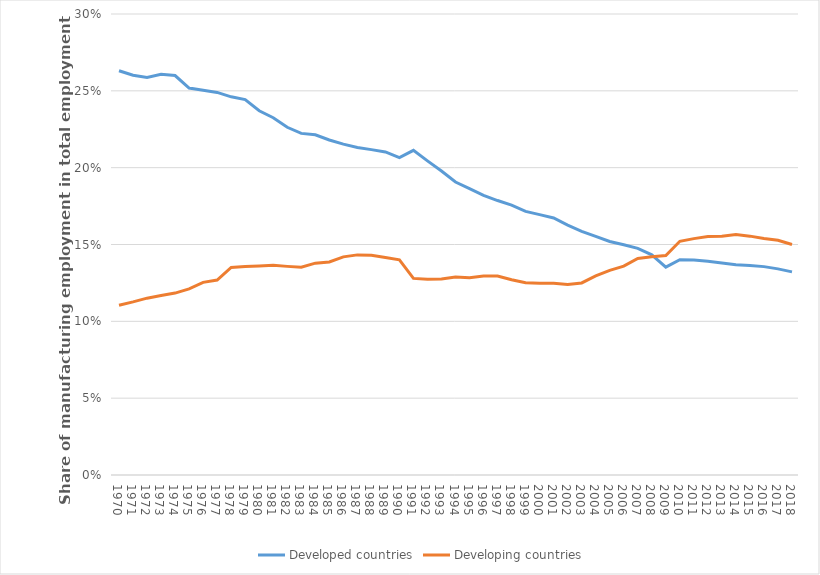
| Category | Developed countries | Developing countries |
|---|---|---|
| 1970.0 | 0.263 | 0.11 |
| 1971.0 | 0.26 | 0.113 |
| 1972.0 | 0.259 | 0.115 |
| 1973.0 | 0.261 | 0.117 |
| 1974.0 | 0.26 | 0.118 |
| 1975.0 | 0.252 | 0.121 |
| 1976.0 | 0.25 | 0.125 |
| 1977.0 | 0.249 | 0.127 |
| 1978.0 | 0.246 | 0.135 |
| 1979.0 | 0.244 | 0.136 |
| 1980.0 | 0.237 | 0.136 |
| 1981.0 | 0.232 | 0.136 |
| 1982.0 | 0.226 | 0.136 |
| 1983.0 | 0.222 | 0.135 |
| 1984.0 | 0.221 | 0.138 |
| 1985.0 | 0.218 | 0.139 |
| 1986.0 | 0.215 | 0.142 |
| 1987.0 | 0.213 | 0.143 |
| 1988.0 | 0.212 | 0.143 |
| 1989.0 | 0.21 | 0.142 |
| 1990.0 | 0.207 | 0.14 |
| 1991.0 | 0.211 | 0.128 |
| 1992.0 | 0.204 | 0.127 |
| 1993.0 | 0.198 | 0.128 |
| 1994.0 | 0.191 | 0.129 |
| 1995.0 | 0.186 | 0.128 |
| 1996.0 | 0.182 | 0.129 |
| 1997.0 | 0.179 | 0.129 |
| 1998.0 | 0.176 | 0.127 |
| 1999.0 | 0.172 | 0.125 |
| 2000.0 | 0.169 | 0.125 |
| 2001.0 | 0.167 | 0.125 |
| 2002.0 | 0.163 | 0.124 |
| 2003.0 | 0.159 | 0.125 |
| 2004.0 | 0.155 | 0.13 |
| 2005.0 | 0.152 | 0.133 |
| 2006.0 | 0.15 | 0.136 |
| 2007.0 | 0.148 | 0.141 |
| 2008.0 | 0.143 | 0.142 |
| 2009.0 | 0.135 | 0.143 |
| 2010.0 | 0.14 | 0.152 |
| 2011.0 | 0.14 | 0.154 |
| 2012.0 | 0.139 | 0.155 |
| 2013.0 | 0.138 | 0.155 |
| 2014.0 | 0.137 | 0.157 |
| 2015.0 | 0.136 | 0.155 |
| 2016.0 | 0.136 | 0.154 |
| 2017.0 | 0.134 | 0.153 |
| 2018.0 | 0.132 | 0.15 |